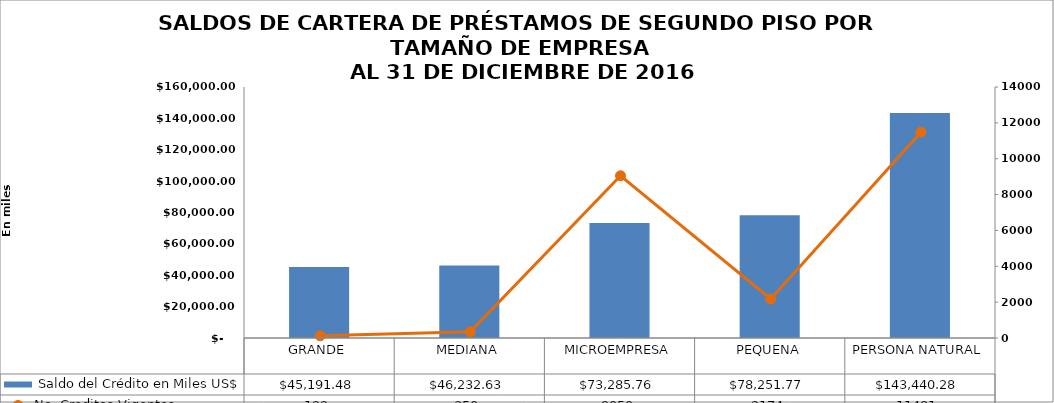
| Category |  Saldo del Crédito en Miles US$ |
|---|---|
| GRANDE | 45191.475 |
| MEDIANA | 46232.633 |
| MICROEMPRESA | 73285.758 |
| PEQUENA | 78251.773 |
| PERSONA NATURAL | 143440.284 |